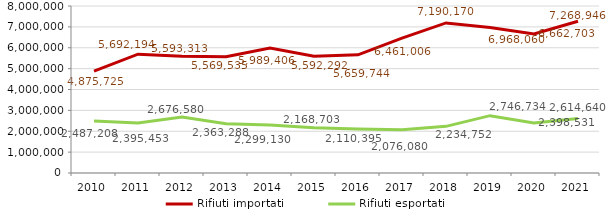
| Category | Rifiuti importati | Rifiuti esportati |
|---|---|---|
| 2010.0 | 4875725 | 2487208 |
| 2011.0 | 5692194 | 2395453 |
| 2012.0 | 5593313 | 2676580 |
| 2013.0 | 5569535 | 2363288 |
| 2014.0 | 5989406 | 2299130 |
| 2015.0 | 5592292 | 2168703 |
| 2016.0 | 5659744 | 2110395 |
| 2017.0 | 6461006 | 2076080 |
| 2018.0 | 7190170 | 2234752 |
| 2019.0 | 6968060 | 2746734 |
| 2020.0 | 6662703 | 2398531 |
| 2021.0 | 7268946 | 2614640 |